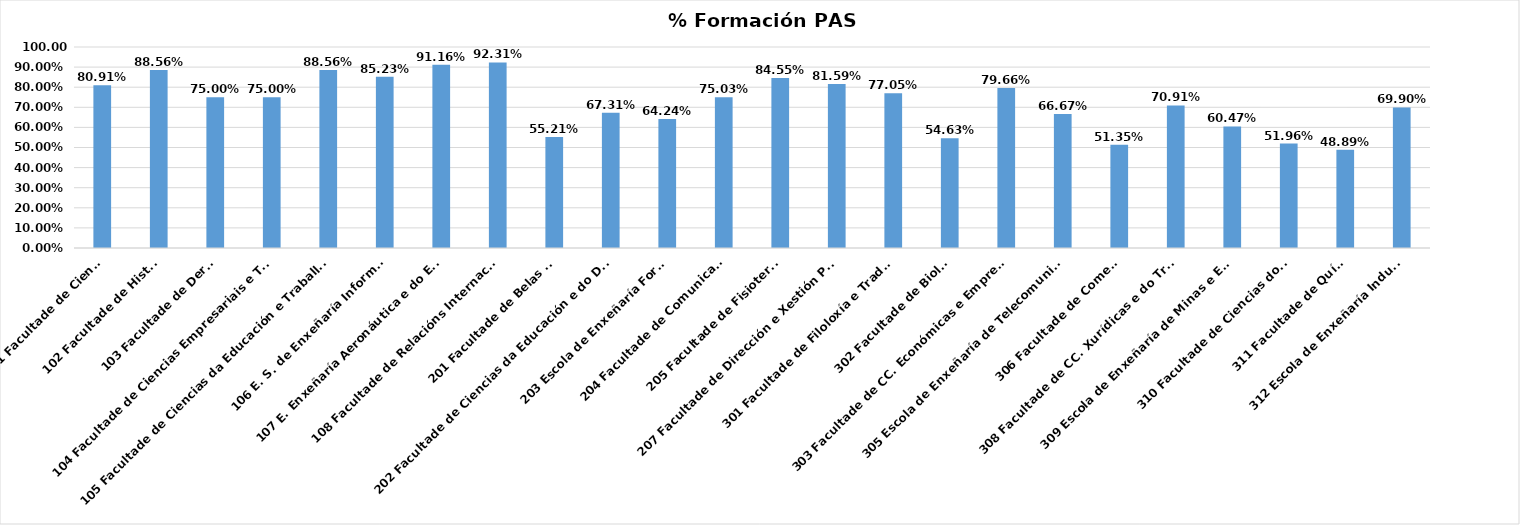
| Category | Series 0 |
|---|---|
| 101 Facultade de Ciencias | 0.809 |
| 102 Facultade de Historia | 0.886 |
| 103 Facultade de Dereito | 0.75 |
| 104 Facultade de Ciencias Empresariais e Turismo | 0.75 |
| 105 Facultade de Ciencias da Educación e Traballo Social | 0.886 |
| 106 E. S. de Enxeñaría Informática | 0.852 |
| 107 E. Enxeñaría Aeronáutica e do Espazo | 0.912 |
| 108 Facultade de Relacións Internacionais | 0.923 |
| 201 Facultade de Belas Artes | 0.552 |
| 202 Facultade de Ciencias da Educación e do Deporte | 0.673 |
| 203 Escola de Enxeñaría Forestal | 0.642 |
| 204 Facultade de Comunicación | 0.75 |
| 205 Facultade de Fisioterapia | 0.845 |
| 207 Facultade de Dirección e Xestión Pública | 0.816 |
| 301 Facultade de Filoloxía e Tradución | 0.77 |
| 302 Facultade de Bioloxía | 0.546 |
| 303 Facultade de CC. Económicas e Empresariais | 0.797 |
| 305 Escola de Enxeñaría de Telecomunicación | 0.667 |
| 306 Facultade de Comercio | 0.514 |
| 308 Facultade de CC. Xurídicas e do Traballo | 0.709 |
| 309 Escola de Enxeñaría de Minas e Enerxía | 0.605 |
| 310 Facultade de Ciencias do Mar | 0.52 |
| 311 Facultade de Química | 0.489 |
| 312 Escola de Enxeñaría Industrial | 0.699 |